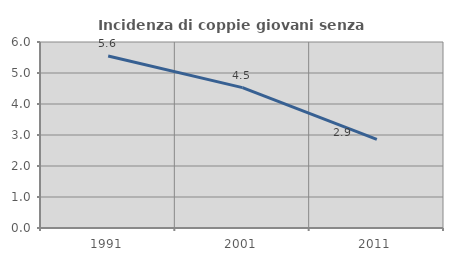
| Category | Incidenza di coppie giovani senza figli |
|---|---|
| 1991.0 | 5.55 |
| 2001.0 | 4.528 |
| 2011.0 | 2.856 |